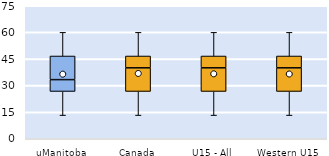
| Category | 25th | 50th | 75th |
|---|---|---|---|
| uManitoba | 26.667 | 6.667 | 13.333 |
| Canada | 26.667 | 13.333 | 6.667 |
| U15 - All | 26.667 | 13.333 | 6.667 |
| Western U15 | 26.667 | 13.333 | 6.667 |